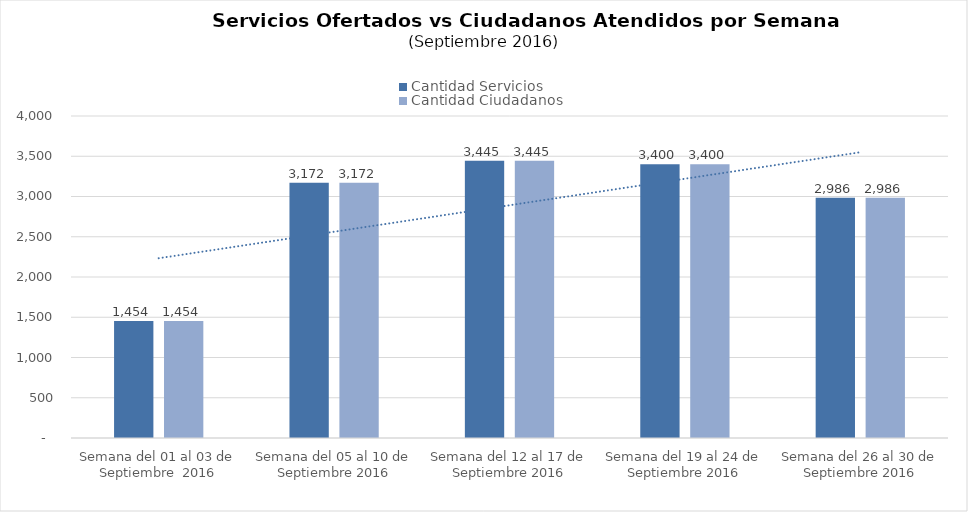
| Category | Cantidad Servicios | Cantidad Ciudadanos |
|---|---|---|
| Semana del 01 al 03 de Septiembre  2016 | 1454 | 1454 |
| Semana del 05 al 10 de Septiembre 2016 | 3172 | 3172 |
| Semana del 12 al 17 de Septiembre 2016 | 3445 | 3445 |
| Semana del 19 al 24 de Septiembre 2016 | 3400 | 3400 |
| Semana del 26 al 30 de Septiembre 2016 | 2986 | 2986 |